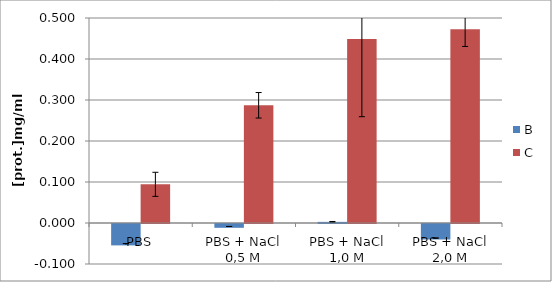
| Category | B | C |
|---|---|---|
| PBS | -0.052 | 0.094 |
| PBS + NaCl 0,5 M | -0.009 | 0.287 |
| PBS + NaCl 1,0 M | 0.003 | 0.449 |
| PBS + NaCl 2,0 M | -0.038 | 0.472 |